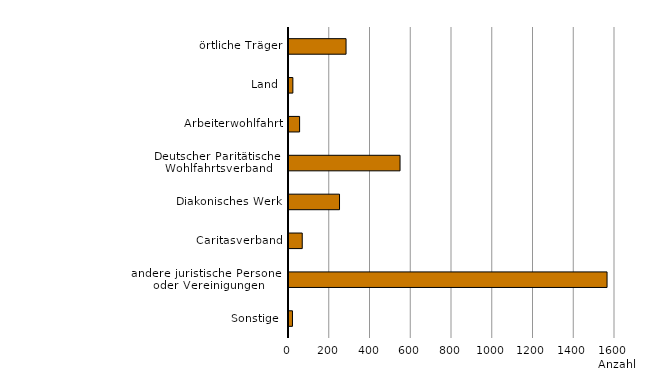
| Category | Series 0 |
|---|---|
| Sonstige | 17 |
| andere juristische Personen oder Vereinigungen | 1561 |
| Caritasverband | 65 |
| Diakonisches Werk | 248 |
| Deutscher Paritätischer Wohlfahrtsverband | 545 |
| Arbeiterwohlfahrt | 52 |
| Land | 19 |
| örtliche Träger | 280 |